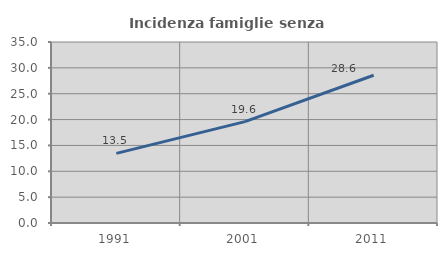
| Category | Incidenza famiglie senza nuclei |
|---|---|
| 1991.0 | 13.467 |
| 2001.0 | 19.605 |
| 2011.0 | 28.575 |